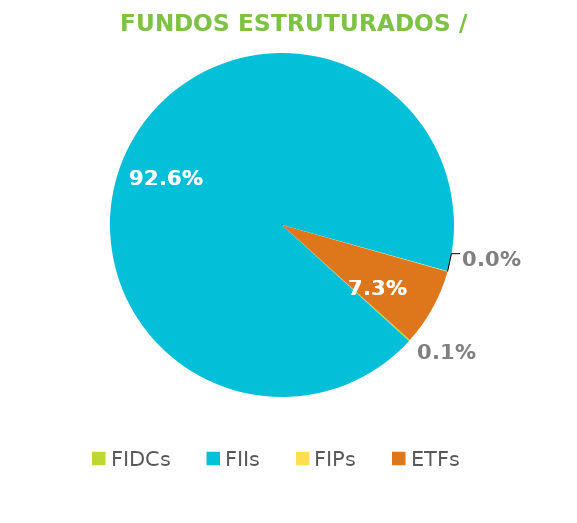
| Category | Fundos Estruturados / ETFs |
|---|---|
| FIDCs | 0.001 |
| FIIs | 0.926 |
| FIPs | 0 |
| ETFs | 0.073 |